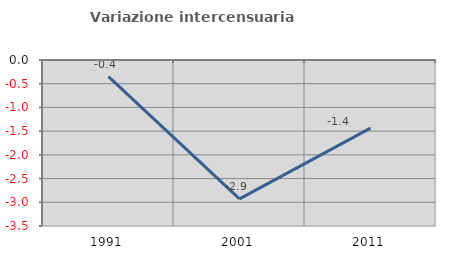
| Category | Variazione intercensuaria annua |
|---|---|
| 1991.0 | -0.35 |
| 2001.0 | -2.929 |
| 2011.0 | -1.435 |